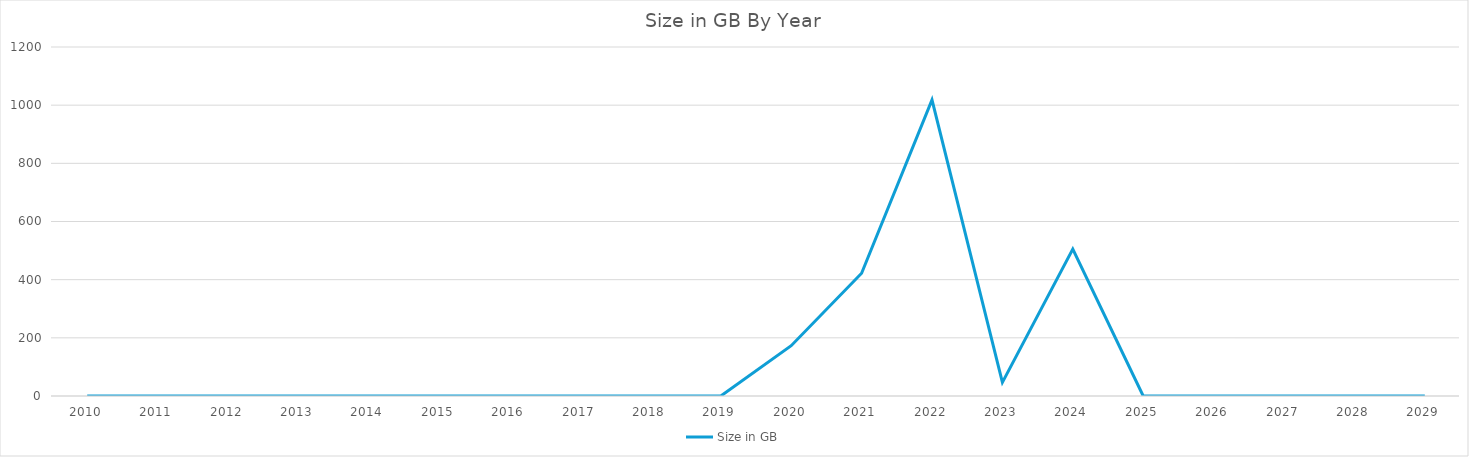
| Category | Size in GB |
|---|---|
| 2010.0 | 0 |
| 2011.0 | 0 |
| 2012.0 | 0 |
| 2013.0 | 0 |
| 2014.0 | 0 |
| 2015.0 | 0 |
| 2016.0 | 0 |
| 2017.0 | 0 |
| 2018.0 | 0 |
| 2019.0 | 0 |
| 2020.0 | 173 |
| 2021.0 | 422 |
| 2022.0 | 1018 |
| 2023.0 | 47 |
| 2024.0 | 505 |
| 2025.0 | 0 |
| 2026.0 | 0 |
| 2027.0 | 0 |
| 2028.0 | 0 |
| 2029.0 | 0 |